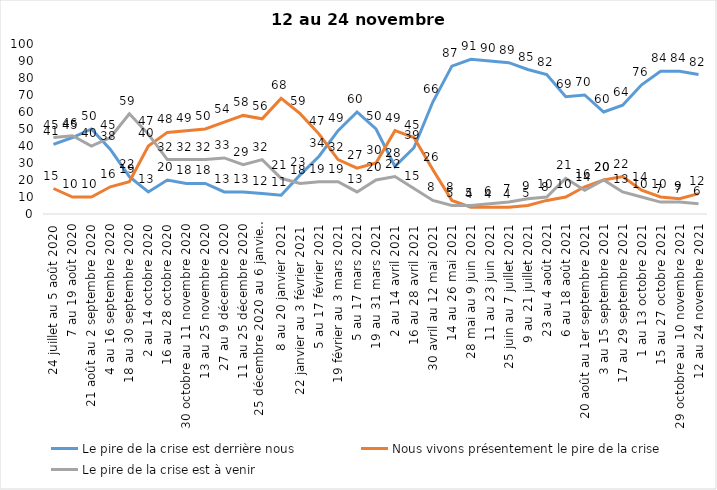
| Category | Le pire de la crise est derrière nous | Nous vivons présentement le pire de la crise | Le pire de la crise est à venir |
|---|---|---|---|
| 24 juillet au 5 août 2020 | 41 | 15 | 45 |
| 7 au 19 août 2020 | 45 | 10 | 46 |
| 21 août au 2 septembre 2020 | 50 | 10 | 40 |
| 4 au 16 septembre 2020 | 38 | 16 | 45 |
| 18 au 30 septembre 2020 | 22 | 19 | 59 |
| 2 au 14 octobre 2020 | 13 | 40 | 47 |
| 16 au 28 octobre 2020 | 20 | 48 | 32 |
| 30 octobre au 11 novembre 2020 | 18 | 49 | 32 |
| 13 au 25 novembre 2020 | 18 | 50 | 32 |
| 27 au 9 décembre 2020 | 13 | 54 | 33 |
| 11 au 25 décembre 2020 | 13 | 58 | 29 |
| 25 décembre 2020 au 6 janvier 2021 | 12 | 56 | 32 |
| 8 au 20 janvier 2021 | 11 | 68 | 21 |
| 22 janvier au 3 février 2021 | 23 | 59 | 18 |
| 5 au 17 février 2021 | 34 | 47 | 19 |
| 19 février au 3 mars 2021 | 49 | 32 | 19 |
| 5 au 17 mars 2021 | 60 | 27 | 13 |
| 19 au 31 mars 2021 | 50 | 30 | 20 |
| 2 au 14 avril 2021 | 28 | 49 | 22 |
| 16 au 28 avril 2021 | 39 | 45 | 15 |
| 30 avril au 12 mai 2021 | 66 | 26 | 8 |
| 14 au 26 mai 2021 | 87 | 8 | 5 |
| 28 mai au 9 juin 2021 | 91 | 4 | 5 |
| 11 au 23 juin 2021 | 90 | 4 | 6 |
| 25 juin au 7 juillet 2021 | 89 | 4 | 7 |
| 9 au 21 juillet 2021 | 85 | 5 | 9 |
| 23 au 4 août 2021 | 82 | 8 | 10 |
| 6 au 18 août 2021 | 69 | 10 | 21 |
| 20 août au 1er septembre 2021 | 70 | 16 | 14 |
| 3 au 15 septembre 2021 | 60 | 20 | 20 |
| 17 au 29 septembre 2021 | 64 | 22 | 13 |
| 1 au 13 octobre 2021 | 76 | 14 | 10 |
| 15 au 27 octobre 2021 | 84 | 10 | 7 |
| 29 octobre au 10 novembre 2021 | 84 | 9 | 7 |
| 12 au 24 novembre 2021 | 82 | 12 | 6 |